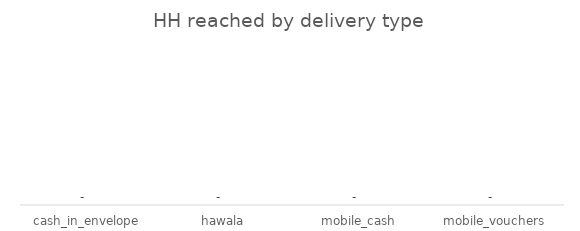
| Category | Series 0 |
|---|---|
| cash_in_envelope | 0 |
| hawala | 0 |
| mobile_cash | 0 |
| mobile_vouchers | 0 |